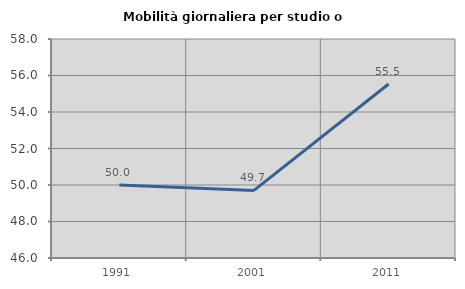
| Category | Mobilità giornaliera per studio o lavoro |
|---|---|
| 1991.0 | 50 |
| 2001.0 | 49.702 |
| 2011.0 | 55.535 |